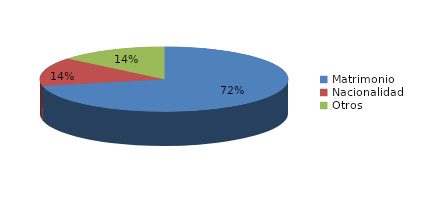
| Category | Series 0 |
|---|---|
| Matrimonio | 388 |
| Nacionalidad | 78 |
| Otros | 76 |